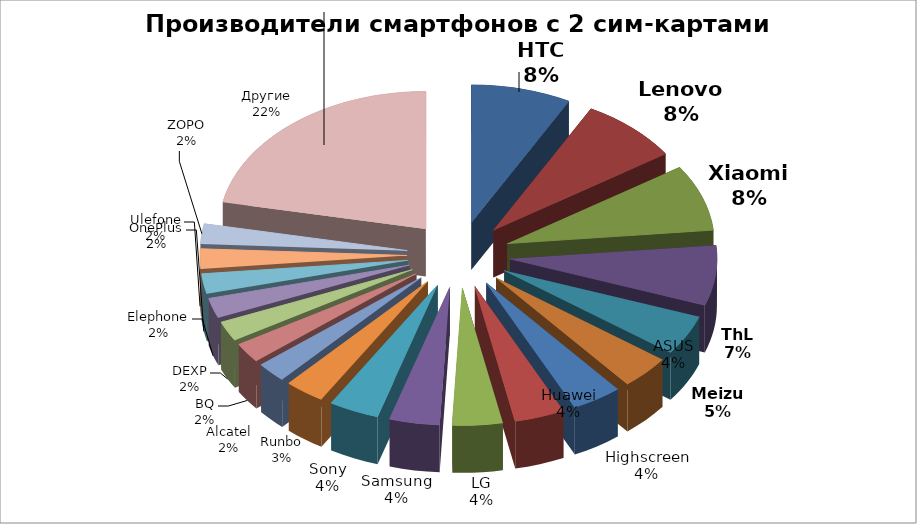
| Category | Series 0 |
|---|---|
| HTC | 10 |
| Lenovo | 10 |
| Xiaomi | 10 |
| ThL | 9 |
| Meizu | 6 |
| ASUS | 5 |
| Highscreen | 5 |
| Huawei | 5 |
| LG | 5 |
| Samsung | 5 |
| Sony | 5 |
| Runbo | 4 |
| Alcatel | 3 |
| BQ | 3 |
| DEXP | 3 |
| Elephone | 3 |
| OnePlus | 3 |
| Ulefone | 3 |
| ZOPO | 3 |
| Другие | 28 |